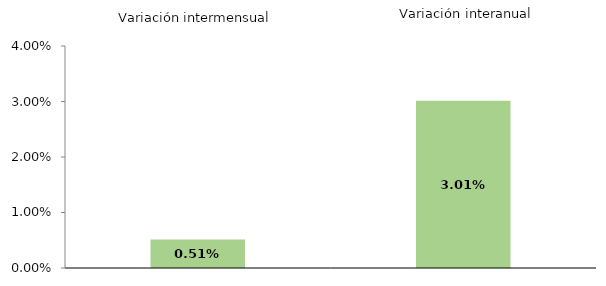
| Category | Series 0 |
|---|---|
| 0 | 0.513 |
| 1 | 3.013 |